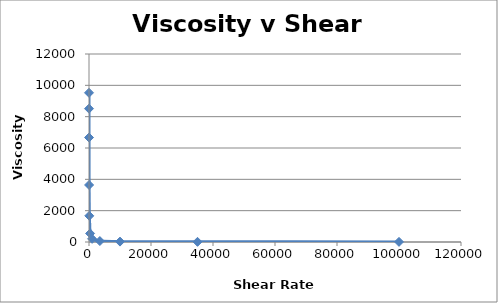
| Category | Viscosity cP |
|---|---|
| 1.0 | 9524.048 |
| 3.5 | 8511.383 |
| 10.0 | 6668.333 |
| 35.0 | 3639.545 |
| 100.0 | 1670.833 |
| 350.0 | 545.27 |
| 1000.0 | 200.98 |
| 3500.0 | 61.79 |
| 10000.0 | 24.95 |
| 35000.0 | 10.708 |
| 100000.0 | 6.999 |